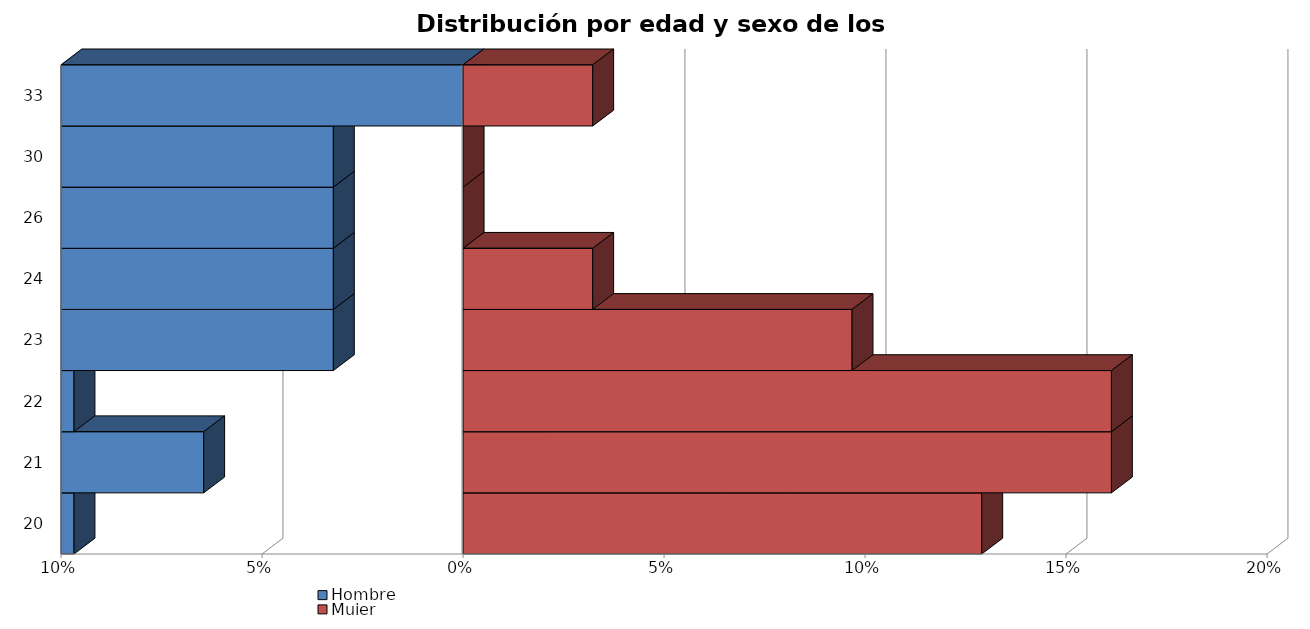
| Category | Hombre | Mujer |
|---|---|---|
| 20.0 | -0.097 | 0.129 |
| 21.0 | -0.065 | 0.161 |
| 22.0 | -0.097 | 0.161 |
| 23.0 | -0.032 | 0.097 |
| 24.0 | -0.032 | 0.032 |
| 26.0 | -0.032 | 0 |
| 30.0 | -0.032 | 0 |
| 33.0 | 0 | 0.032 |